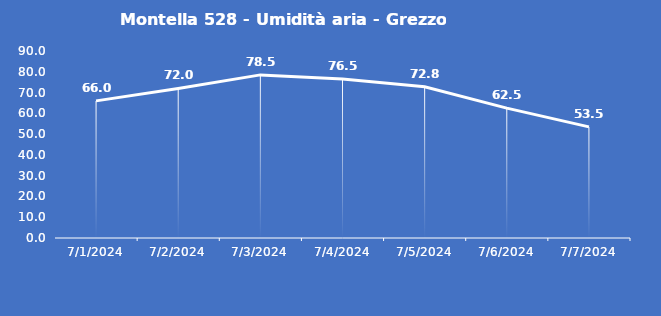
| Category | Montella 528 - Umidità aria - Grezzo (%) |
|---|---|
| 7/1/24 | 66 |
| 7/2/24 | 72 |
| 7/3/24 | 78.5 |
| 7/4/24 | 76.5 |
| 7/5/24 | 72.8 |
| 7/6/24 | 62.5 |
| 7/7/24 | 53.5 |